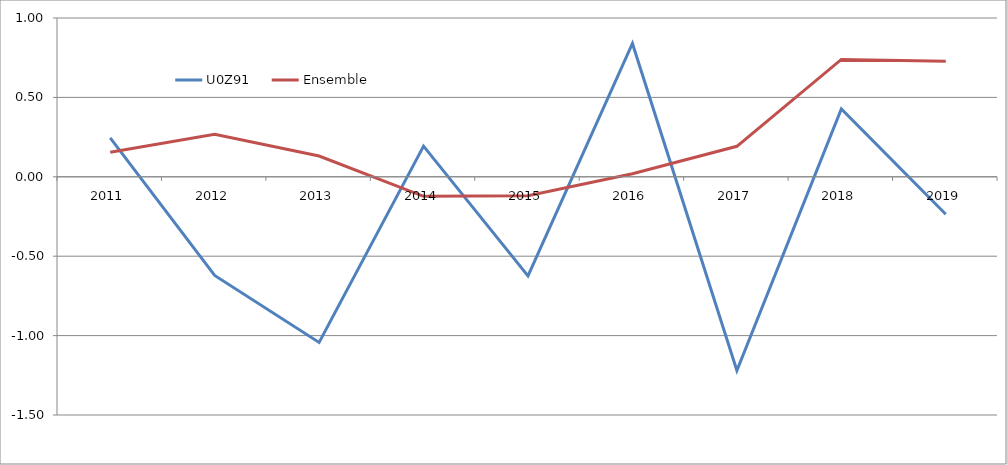
| Category | U0Z91 | Ensemble |
|---|---|---|
| 2011 | 0.245 | 0.155 |
| 2012 | -0.621 | 0.268 |
| 2013 | -1.043 | 0.131 |
| 2014 | 0.193 | -0.123 |
| 2015 | -0.625 | -0.12 |
| 2016 | 0.84 | 0.019 |
| 2017 | -1.219 | 0.192 |
| 2018 | 0.428 | 0.739 |
| 2019 | -0.236 | 0.728 |